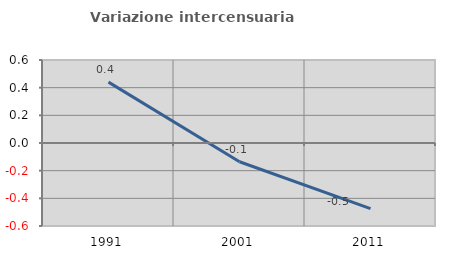
| Category | Variazione intercensuaria annua |
|---|---|
| 1991.0 | 0.44 |
| 2001.0 | -0.136 |
| 2011.0 | -0.474 |